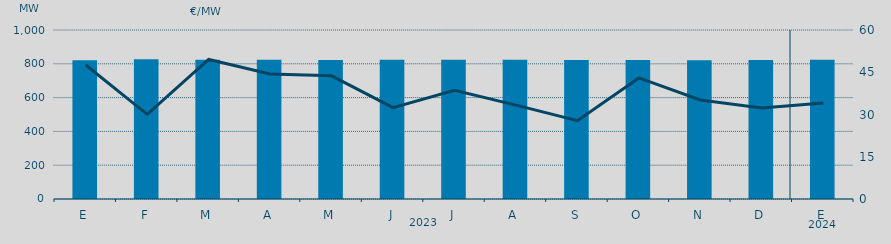
| Category | Potencia media a subir |
|---|---|
| E | 820.977 |
| F | 826.222 |
| M | 823.778 |
| A | 823.61 |
| M | 822.859 |
| J | 823.94 |
| J | 824.277 |
| A | 824.017 |
| S | 822.566 |
| O | 822.965 |
| N | 821.304 |
| D | 822.258 |
| E | 823.457 |